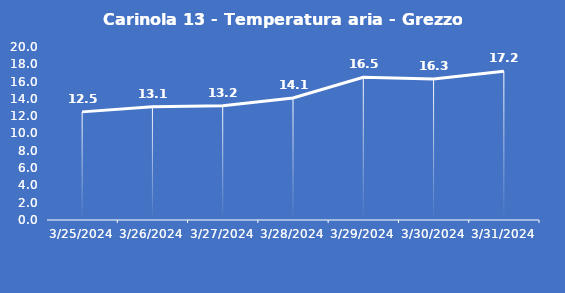
| Category | Carinola 13 - Temperatura aria - Grezzo (°C) |
|---|---|
| 3/25/24 | 12.5 |
| 3/26/24 | 13.1 |
| 3/27/24 | 13.2 |
| 3/28/24 | 14.1 |
| 3/29/24 | 16.5 |
| 3/30/24 | 16.3 |
| 3/31/24 | 17.2 |